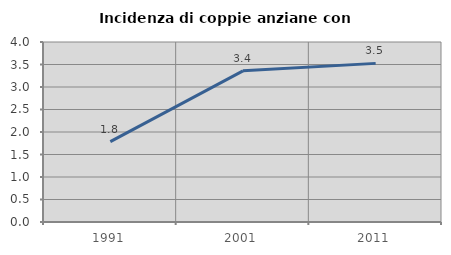
| Category | Incidenza di coppie anziane con figli |
|---|---|
| 1991.0 | 1.786 |
| 2001.0 | 3.36 |
| 2011.0 | 3.525 |